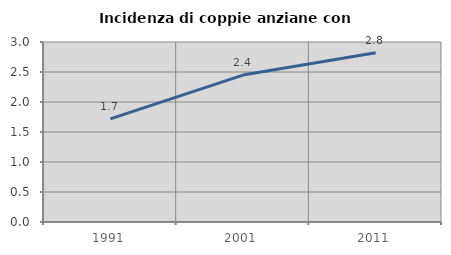
| Category | Incidenza di coppie anziane con figli |
|---|---|
| 1991.0 | 1.718 |
| 2001.0 | 2.448 |
| 2011.0 | 2.821 |